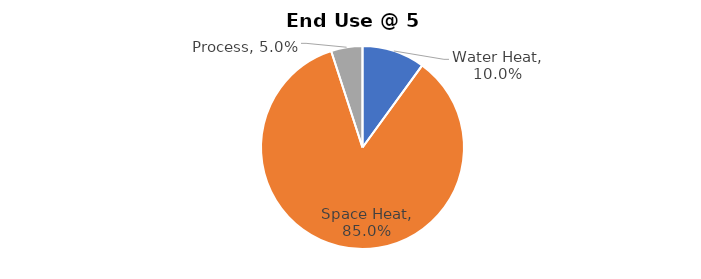
| Category | Series 0 |
|---|---|
| Water Heat | 0.1 |
| Space Heat | 0.85 |
| Process | 0.05 |